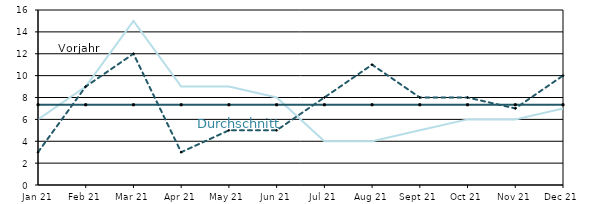
| Category | Berichtsjahr | Durchschnitt | Vorjahr |
|---|---|---|---|
| 2021-01-01 | 6 | 7.333 | 3 |
| 2021-02-01 | 9 | 7.333 | 9 |
| 2021-03-01 | 15 | 7.333 | 12 |
| 2021-04-01 | 9 | 7.333 | 3 |
| 2021-05-01 | 9 | 7.333 | 5 |
| 2021-06-01 | 8 | 7.333 | 5 |
| 2021-07-01 | 4 | 7.333 | 8 |
| 2021-08-01 | 4 | 7.333 | 11 |
| 2021-09-01 | 5 | 7.333 | 8 |
| 2021-10-01 | 6 | 7.333 | 8 |
| 2021-11-01 | 6 | 7.333 | 7 |
| 2021-12-01 | 7 | 7.333 | 10 |